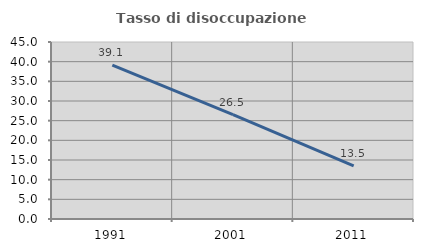
| Category | Tasso di disoccupazione giovanile  |
|---|---|
| 1991.0 | 39.094 |
| 2001.0 | 26.522 |
| 2011.0 | 13.497 |